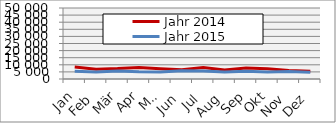
| Category | Jahr 2014 | Jahr 2015 |
|---|---|---|
| 0 | 8485.684 | 5449.959 |
| 1 | 6902.319 | 4927.237 |
| 2 | 7364.743 | 5600.379 |
| 3 | 8167.747 | 5071.907 |
| 4 | 7230.315 | 4968.781 |
| 5 | 6496.041 | 5785.933 |
| 6 | 8060.343 | 5685.928 |
| 7 | 6284.971 | 4861.133 |
| 8 | 7791.664 | 5411.799 |
| 9 | 7285.339 | 4959.438 |
| 10 | 6023.235 | 5197.254 |
| 11 | 5455.345 | 4768.288 |